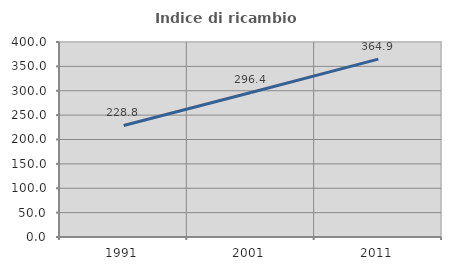
| Category | Indice di ricambio occupazionale  |
|---|---|
| 1991.0 | 228.781 |
| 2001.0 | 296.428 |
| 2011.0 | 364.881 |